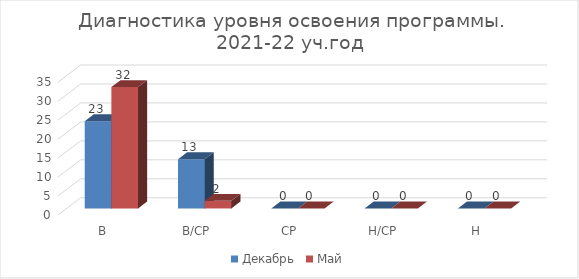
| Category | Декабрь | Май |
|---|---|---|
| В | 23 | 32 |
| В/СР | 13 | 2 |
| СР | 0 | 0 |
| Н/СР | 0 | 0 |
| Н | 0 | 0 |